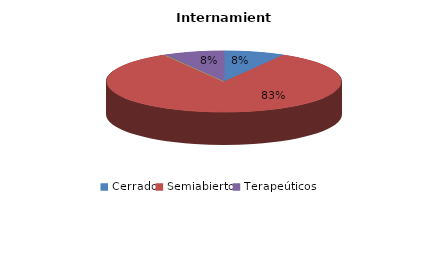
| Category | Series 0 |
|---|---|
| Cerrado | 1 |
| Semiabierto | 10 |
| Abierto | 0 |
| Terapeúticos | 1 |